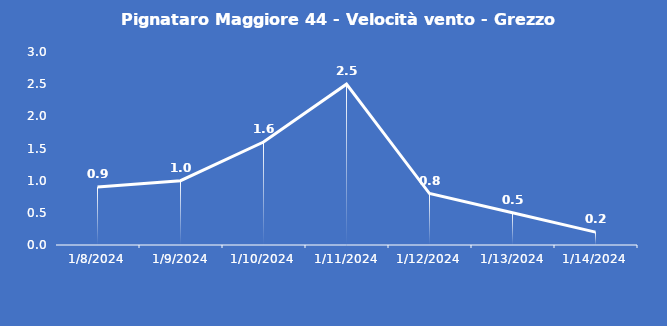
| Category | Pignataro Maggiore 44 - Velocità vento - Grezzo (m/s) |
|---|---|
| 1/8/24 | 0.9 |
| 1/9/24 | 1 |
| 1/10/24 | 1.6 |
| 1/11/24 | 2.5 |
| 1/12/24 | 0.8 |
| 1/13/24 | 0.5 |
| 1/14/24 | 0.2 |